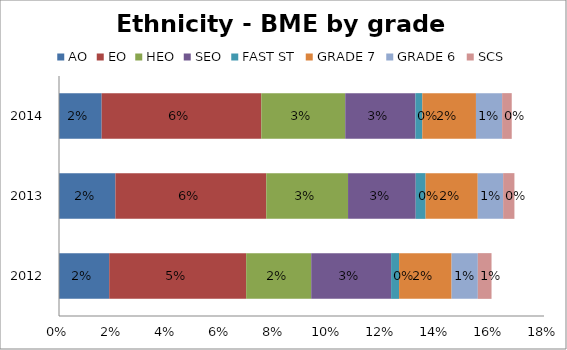
| Category | AO | EO | HEO | SEO | FAST ST | GRADE 7 | GRADE 6 | SCS |
|---|---|---|---|---|---|---|---|---|
| 2012.0 | 0.019 | 0.051 | 0.024 | 0.03 | 0.003 | 0.019 | 0.01 | 0.005 |
| 2013.0 | 0.021 | 0.056 | 0.03 | 0.025 | 0.004 | 0.019 | 0.009 | 0.004 |
| 2014.0 | 0.016 | 0.059 | 0.031 | 0.026 | 0.003 | 0.02 | 0.01 | 0.004 |